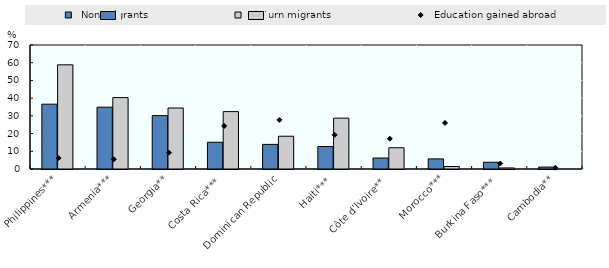
| Category |   Non-migrants |   Return migrants |
|---|---|---|
| Philippines*** | 36.6 | 58.8 |
| Armenia*** | 34.9 | 40.3 |
| Georgia** | 30.14 | 34.42 |
| Costa Rica*** | 15.1 | 32.4 |
| Dominican Republic | 13.9 | 18.5 |
| Haiti*** | 12.7 | 28.7 |
| Côte d'Ivoire** | 6.2 | 12 |
| Morocco*** | 5.7 | 1.4 |
| Burkina Faso*** | 3.8 | 0.6 |
| Cambodia** | 1.1 | 0 |